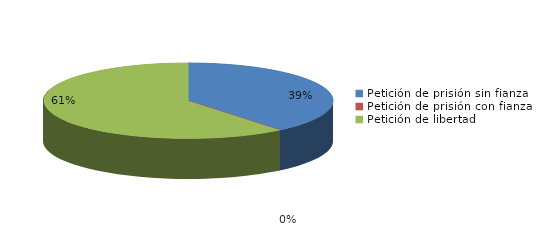
| Category | Series 0 |
|---|---|
| Petición de prisión sin fianza | 148 |
| Petición de prisión con fianza | 0 |
| Petición de libertad | 230 |